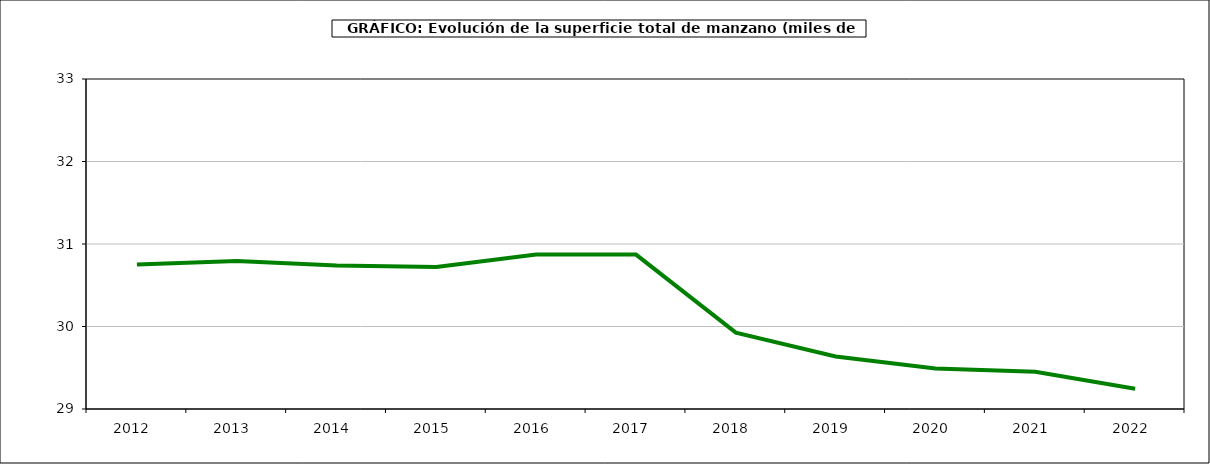
| Category | superficie manzano |
|---|---|
| 2012.0 | 30.753 |
| 2013.0 | 30.794 |
| 2014.0 | 30.739 |
| 2015.0 | 30.721 |
| 2016.0 | 30.872 |
| 2017.0 | 30.872 |
| 2018.0 | 29.925 |
| 2019.0 | 29.637 |
| 2020.0 | 29.49 |
| 2021.0 | 29.451 |
| 2022.0 | 29.246 |